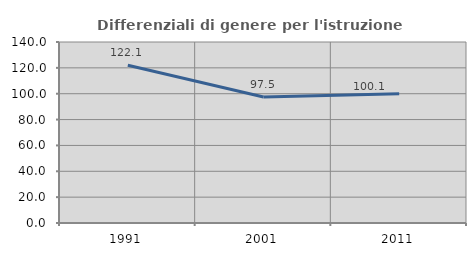
| Category | Differenziali di genere per l'istruzione superiore |
|---|---|
| 1991.0 | 122.058 |
| 2001.0 | 97.52 |
| 2011.0 | 100.055 |